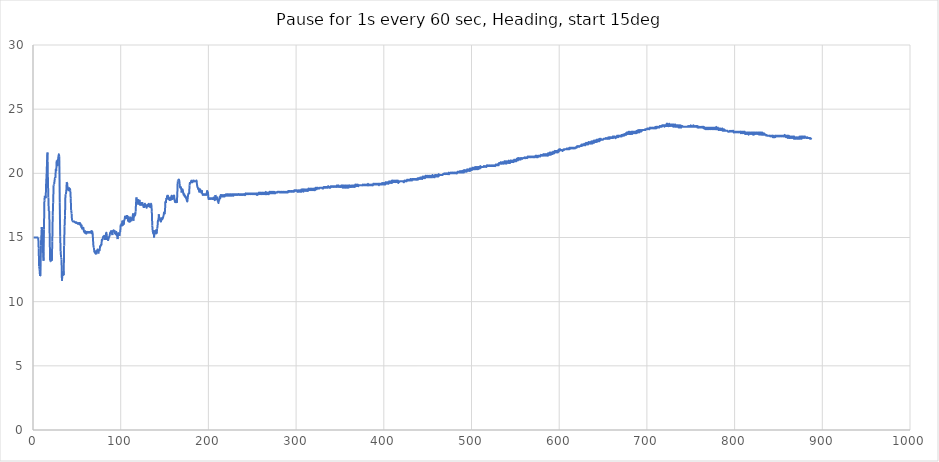
| Category | Column2 |
|---|---|
| 0.5 | 15 |
| 1.0 | 15 |
| 1.5 | 15 |
| 2.0 | 15 |
| 2.5 | 15 |
| 3.0 | 15 |
| 3.5 | 15 |
| 4.0 | 15 |
| 4.5 | 15 |
| 5.0 | 15 |
| 5.5 | 15 |
| 6.0 | 15 |
| 6.5 | 14.125 |
| 7.0 | 12.75 |
| 7.5 | 12.5 |
| 8.0 | 12 |
| 8.5 | 12 |
| 9.0 | 14.375 |
| 9.5 | 15.125 |
| 10.0 | 15.812 |
| 10.5 | 15.188 |
| 11.0 | 13.812 |
| 11.5 | 13.938 |
| 12.0 | 13.188 |
| 12.5 | 15.625 |
| 13.0 | 17.875 |
| 13.5 | 18.25 |
| 14.0 | 18.188 |
| 14.5 | 18.062 |
| 15.0 | 19.25 |
| 15.5 | 19.875 |
| 16.0 | 20.875 |
| 16.5 | 21.625 |
| 17.0 | 19.562 |
| 17.5 | 18.125 |
| 18.0 | 17.062 |
| 18.5 | 17.062 |
| 19.0 | 15.188 |
| 19.5 | 13.25 |
| 20.0 | 13.125 |
| 20.5 | 13.125 |
| 21.0 | 13.625 |
| 21.5 | 13.188 |
| 22.0 | 14.688 |
| 22.5 | 16.688 |
| 23.0 | 17.75 |
| 23.5 | 19.062 |
| 24.0 | 19.125 |
| 24.5 | 19.375 |
| 25.0 | 19.625 |
| 25.5 | 19.625 |
| 26.0 | 20.312 |
| 26.5 | 20.188 |
| 27.0 | 21 |
| 27.5 | 21 |
| 28.0 | 20.562 |
| 28.5 | 21.125 |
| 29.0 | 21.312 |
| 29.5 | 21.5 |
| 30.0 | 21.312 |
| 30.5 | 17.75 |
| 31.0 | 15.062 |
| 31.5 | 13.938 |
| 32.0 | 13.438 |
| 32.5 | 13.312 |
| 33.0 | 11.625 |
| 33.5 | 12.062 |
| 34.0 | 12 |
| 34.5 | 12.375 |
| 35.0 | 12.062 |
| 35.5 | 14.375 |
| 36.0 | 15.875 |
| 36.5 | 16.688 |
| 37.0 | 18.375 |
| 37.5 | 18.375 |
| 38.0 | 18.625 |
| 38.5 | 19.312 |
| 39.0 | 19.25 |
| 39.5 | 18.688 |
| 40.0 | 18.812 |
| 40.5 | 18.688 |
| 41.0 | 18.875 |
| 41.5 | 18.688 |
| 42.0 | 18.812 |
| 42.5 | 18.688 |
| 43.0 | 18.062 |
| 43.5 | 17.125 |
| 44.0 | 16.875 |
| 44.5 | 16.312 |
| 45.0 | 16.312 |
| 45.5 | 16.25 |
| 46.0 | 16.25 |
| 46.5 | 16.25 |
| 47.0 | 16.25 |
| 47.5 | 16.188 |
| 48.0 | 16.188 |
| 48.5 | 16.188 |
| 49.0 | 16.125 |
| 49.5 | 16.188 |
| 50.0 | 16.125 |
| 50.5 | 16.125 |
| 51.0 | 16.062 |
| 51.5 | 16.125 |
| 52.0 | 16.062 |
| 52.5 | 16.125 |
| 53.0 | 16 |
| 53.5 | 16.125 |
| 54.0 | 16.062 |
| 54.5 | 16 |
| 55.0 | 15.812 |
| 55.5 | 15.938 |
| 56.0 | 15.688 |
| 56.5 | 15.75 |
| 57.0 | 15.688 |
| 57.5 | 15.75 |
| 58.0 | 15.5 |
| 58.5 | 15.438 |
| 59.0 | 15.375 |
| 59.5 | 15.5 |
| 60.0 | 15.375 |
| 60.5 | 15.312 |
| 61.0 | 15.312 |
| 61.5 | 15.438 |
| 62.0 | 15.375 |
| 62.5 | 15.438 |
| 63.0 | 15.375 |
| 63.5 | 15.438 |
| 64.0 | 15.375 |
| 64.5 | 15.438 |
| 65.0 | 15.375 |
| 65.5 | 15.438 |
| 66.0 | 15.375 |
| 66.5 | 15.5 |
| 67.0 | 15.312 |
| 67.5 | 15.5 |
| 68.0 | 15.312 |
| 68.5 | 14.75 |
| 69.0 | 14.25 |
| 69.5 | 14.188 |
| 70.0 | 13.875 |
| 70.5 | 13.938 |
| 71.0 | 13.75 |
| 71.5 | 13.938 |
| 72.0 | 13.688 |
| 72.5 | 14 |
| 73.0 | 13.875 |
| 73.5 | 14.062 |
| 74.0 | 14 |
| 74.5 | 13.75 |
| 75.0 | 13.938 |
| 75.5 | 14.062 |
| 76.0 | 14 |
| 76.5 | 14.312 |
| 77.0 | 14.312 |
| 77.5 | 14.438 |
| 78.0 | 14.438 |
| 78.5 | 14.812 |
| 79.0 | 14.812 |
| 79.5 | 14.875 |
| 80.0 | 15.062 |
| 80.5 | 15.062 |
| 81.0 | 15.062 |
| 81.5 | 15.188 |
| 82.0 | 14.812 |
| 82.5 | 15.125 |
| 83.0 | 15.188 |
| 83.5 | 15.375 |
| 84.0 | 15.25 |
| 84.5 | 14.812 |
| 85.0 | 15.062 |
| 85.5 | 14.75 |
| 86.0 | 14.875 |
| 86.5 | 15 |
| 87.0 | 15.062 |
| 87.5 | 15.188 |
| 88.0 | 15.375 |
| 88.5 | 15.375 |
| 89.0 | 15.5 |
| 89.5 | 15.438 |
| 90.0 | 15.375 |
| 90.5 | 15.188 |
| 91.0 | 15.562 |
| 91.5 | 15.5 |
| 92.0 | 15.562 |
| 92.5 | 15.438 |
| 93.0 | 15.562 |
| 93.5 | 15.25 |
| 94.0 | 15.25 |
| 94.5 | 15.312 |
| 95.0 | 15.438 |
| 95.5 | 15.188 |
| 96.0 | 15.25 |
| 96.5 | 14.875 |
| 97.0 | 15.375 |
| 97.5 | 15.125 |
| 98.0 | 15.375 |
| 98.5 | 15.125 |
| 99.0 | 15.375 |
| 99.5 | 15.5 |
| 100.0 | 16 |
| 100.5 | 15.938 |
| 101.0 | 16.062 |
| 101.5 | 15.875 |
| 102.0 | 16.312 |
| 102.5 | 15.938 |
| 103.0 | 16.312 |
| 103.5 | 16 |
| 104.0 | 16.375 |
| 104.5 | 16.438 |
| 105.0 | 16.688 |
| 105.5 | 16.438 |
| 106.0 | 16.625 |
| 106.5 | 16.438 |
| 107.0 | 16.75 |
| 107.5 | 16.5 |
| 108.0 | 16.688 |
| 108.5 | 16.25 |
| 109.0 | 16.562 |
| 109.5 | 16.188 |
| 110.0 | 16.375 |
| 110.5 | 16.188 |
| 111.0 | 16.625 |
| 111.5 | 16.438 |
| 112.0 | 16.5 |
| 112.5 | 16.312 |
| 113.0 | 16.5 |
| 113.5 | 16.5 |
| 114.0 | 16.875 |
| 114.5 | 16.312 |
| 115.0 | 16.75 |
| 115.5 | 16.625 |
| 116.0 | 16.875 |
| 116.5 | 16.75 |
| 117.0 | 17 |
| 117.5 | 17.688 |
| 118.0 | 18.125 |
| 118.5 | 17.688 |
| 119.0 | 17.812 |
| 119.5 | 18 |
| 120.0 | 17.562 |
| 120.5 | 17.875 |
| 121.0 | 17.812 |
| 121.5 | 17.938 |
| 122.0 | 17.5 |
| 122.5 | 17.688 |
| 123.0 | 17.562 |
| 123.5 | 17.75 |
| 124.0 | 17.5 |
| 124.5 | 17.75 |
| 125.0 | 17.5 |
| 125.5 | 17.562 |
| 126.0 | 17.375 |
| 126.5 | 17.438 |
| 127.0 | 17.375 |
| 127.5 | 17.625 |
| 128.0 | 17.562 |
| 128.5 | 17.5 |
| 129.0 | 17.5 |
| 129.5 | 17.312 |
| 130.0 | 17.438 |
| 130.5 | 17.5 |
| 131.0 | 17.562 |
| 131.5 | 17.438 |
| 132.0 | 17.625 |
| 132.5 | 17.5 |
| 133.0 | 17.562 |
| 133.5 | 17.375 |
| 134.0 | 17.438 |
| 134.5 | 17.625 |
| 135.0 | 17.5 |
| 135.5 | 17 |
| 136.0 | 15.938 |
| 136.5 | 15.5 |
| 137.0 | 15.312 |
| 137.5 | 15.562 |
| 138.0 | 15 |
| 138.5 | 15.375 |
| 139.0 | 15.375 |
| 139.5 | 15.562 |
| 140.0 | 15.25 |
| 140.5 | 15.625 |
| 141.0 | 15.312 |
| 141.5 | 15.688 |
| 142.0 | 15.875 |
| 142.5 | 16.375 |
| 143.0 | 16.25 |
| 143.5 | 16.812 |
| 144.0 | 16.5 |
| 144.5 | 16.438 |
| 145.0 | 16.375 |
| 145.5 | 16.312 |
| 146.0 | 16.25 |
| 146.5 | 16.562 |
| 147.0 | 16.375 |
| 147.5 | 16.438 |
| 148.0 | 16.5 |
| 148.5 | 16.625 |
| 149.0 | 16.75 |
| 149.5 | 17 |
| 150.0 | 16.812 |
| 150.5 | 17.062 |
| 151.0 | 17.812 |
| 151.5 | 17.688 |
| 152.0 | 18.062 |
| 152.5 | 18 |
| 153.0 | 18.25 |
| 153.5 | 18.188 |
| 154.0 | 18.25 |
| 154.5 | 17.938 |
| 155.0 | 18.125 |
| 155.5 | 17.938 |
| 156.0 | 17.938 |
| 156.5 | 18.125 |
| 157.0 | 17.938 |
| 157.5 | 18 |
| 158.0 | 18.25 |
| 158.5 | 18.188 |
| 159.0 | 18 |
| 159.5 | 18.125 |
| 160.0 | 18.188 |
| 160.5 | 18.25 |
| 161.0 | 18.25 |
| 161.5 | 17.875 |
| 162.0 | 17.75 |
| 162.5 | 17.875 |
| 163.0 | 17.875 |
| 163.5 | 17.812 |
| 164.0 | 17.688 |
| 164.5 | 18.312 |
| 165.0 | 19.375 |
| 165.5 | 19.438 |
| 166.0 | 19.5 |
| 166.5 | 19.5 |
| 167.0 | 19.312 |
| 167.5 | 18.938 |
| 168.0 | 18.875 |
| 168.5 | 18.938 |
| 169.0 | 18.812 |
| 169.5 | 18.5 |
| 170.0 | 18.688 |
| 170.5 | 18.75 |
| 171.0 | 18.625 |
| 171.5 | 18.375 |
| 172.0 | 18.312 |
| 172.5 | 18.375 |
| 173.0 | 18.188 |
| 173.5 | 18.25 |
| 174.0 | 18.188 |
| 174.5 | 18.062 |
| 175.0 | 18 |
| 175.5 | 17.875 |
| 176.0 | 17.812 |
| 176.5 | 18.125 |
| 177.0 | 18.375 |
| 177.5 | 18.438 |
| 178.0 | 18.375 |
| 178.5 | 19.062 |
| 179.0 | 19.312 |
| 179.5 | 19.25 |
| 180.0 | 19.312 |
| 180.5 | 19.438 |
| 181.0 | 19.312 |
| 181.5 | 19.312 |
| 182.0 | 19.312 |
| 182.5 | 19.438 |
| 183.0 | 19.375 |
| 183.5 | 19.438 |
| 184.0 | 19.375 |
| 184.5 | 19.375 |
| 185.0 | 19.375 |
| 185.5 | 19.375 |
| 186.0 | 19.375 |
| 186.5 | 19.438 |
| 187.0 | 19.125 |
| 187.5 | 18.938 |
| 188.0 | 18.875 |
| 188.5 | 18.75 |
| 189.0 | 18.812 |
| 189.5 | 18.562 |
| 190.0 | 18.625 |
| 190.5 | 18.75 |
| 191.0 | 18.688 |
| 191.5 | 18.562 |
| 192.0 | 18.5 |
| 192.5 | 18.688 |
| 193.0 | 18.375 |
| 193.5 | 18.312 |
| 194.0 | 18.375 |
| 194.5 | 18.312 |
| 195.0 | 18.375 |
| 195.5 | 18.312 |
| 196.0 | 18.375 |
| 196.5 | 18.312 |
| 197.0 | 18.375 |
| 197.5 | 18.312 |
| 198.0 | 18.375 |
| 198.5 | 18.625 |
| 199.0 | 18.562 |
| 199.5 | 18.5 |
| 200.0 | 18.062 |
| 200.5 | 18 |
| 201.0 | 18.062 |
| 201.5 | 18 |
| 202.0 | 18.062 |
| 202.5 | 18 |
| 203.0 | 18.062 |
| 203.5 | 18 |
| 204.0 | 18.062 |
| 204.5 | 18 |
| 205.0 | 18.062 |
| 205.5 | 18 |
| 206.0 | 18.125 |
| 206.5 | 18 |
| 207.0 | 17.938 |
| 207.5 | 17.938 |
| 208.0 | 18.312 |
| 208.5 | 18.125 |
| 209.0 | 18 |
| 209.5 | 18.062 |
| 210.0 | 18.125 |
| 210.5 | 17.875 |
| 211.0 | 17.812 |
| 211.5 | 17.688 |
| 212.0 | 17.938 |
| 212.5 | 17.938 |
| 213.0 | 18.188 |
| 213.5 | 18.062 |
| 214.0 | 18.312 |
| 214.5 | 18.188 |
| 215.0 | 18.312 |
| 215.5 | 18.188 |
| 216.0 | 18.312 |
| 216.5 | 18.188 |
| 217.0 | 18.312 |
| 217.5 | 18.188 |
| 218.0 | 18.312 |
| 218.5 | 18.188 |
| 219.0 | 18.312 |
| 219.5 | 18.25 |
| 220.0 | 18.375 |
| 220.5 | 18.25 |
| 221.0 | 18.375 |
| 221.5 | 18.25 |
| 222.0 | 18.375 |
| 222.5 | 18.25 |
| 223.0 | 18.375 |
| 223.5 | 18.25 |
| 224.0 | 18.375 |
| 224.5 | 18.25 |
| 225.0 | 18.375 |
| 225.5 | 18.25 |
| 226.0 | 18.375 |
| 226.5 | 18.25 |
| 227.0 | 18.375 |
| 227.5 | 18.25 |
| 228.0 | 18.375 |
| 228.5 | 18.25 |
| 229.0 | 18.375 |
| 229.5 | 18.312 |
| 230.0 | 18.375 |
| 230.5 | 18.312 |
| 231.0 | 18.375 |
| 231.5 | 18.312 |
| 232.0 | 18.375 |
| 232.5 | 18.312 |
| 233.0 | 18.375 |
| 233.5 | 18.312 |
| 234.0 | 18.375 |
| 234.5 | 18.375 |
| 235.0 | 18.312 |
| 235.5 | 18.375 |
| 236.0 | 18.312 |
| 236.5 | 18.375 |
| 237.0 | 18.312 |
| 237.5 | 18.375 |
| 238.0 | 18.312 |
| 238.5 | 18.375 |
| 239.0 | 18.312 |
| 239.5 | 18.375 |
| 240.0 | 18.312 |
| 240.5 | 18.375 |
| 241.0 | 18.375 |
| 241.5 | 18.312 |
| 242.0 | 18.312 |
| 242.5 | 18.438 |
| 243.0 | 18.375 |
| 243.5 | 18.438 |
| 244.0 | 18.375 |
| 244.5 | 18.438 |
| 245.0 | 18.375 |
| 245.5 | 18.438 |
| 246.0 | 18.375 |
| 246.5 | 18.438 |
| 247.0 | 18.375 |
| 247.5 | 18.438 |
| 248.0 | 18.375 |
| 248.5 | 18.438 |
| 249.0 | 18.375 |
| 249.5 | 18.438 |
| 250.0 | 18.375 |
| 250.5 | 18.438 |
| 251.0 | 18.375 |
| 251.5 | 18.438 |
| 252.0 | 18.375 |
| 252.5 | 18.438 |
| 253.0 | 18.375 |
| 253.5 | 18.438 |
| 254.0 | 18.375 |
| 254.5 | 18.438 |
| 255.0 | 18.312 |
| 255.5 | 18.438 |
| 256.0 | 18.312 |
| 256.5 | 18.438 |
| 257.0 | 18.375 |
| 257.5 | 18.5 |
| 258.0 | 18.375 |
| 258.5 | 18.5 |
| 259.0 | 18.375 |
| 259.5 | 18.5 |
| 260.0 | 18.375 |
| 260.5 | 18.5 |
| 261.0 | 18.375 |
| 261.5 | 18.5 |
| 262.0 | 18.375 |
| 262.5 | 18.5 |
| 263.0 | 18.375 |
| 263.5 | 18.5 |
| 264.0 | 18.375 |
| 264.5 | 18.5 |
| 265.0 | 18.375 |
| 265.5 | 18.562 |
| 266.0 | 18.375 |
| 266.5 | 18.5 |
| 267.0 | 18.375 |
| 267.5 | 18.5 |
| 268.0 | 18.375 |
| 268.5 | 18.5 |
| 269.0 | 18.375 |
| 269.5 | 18.562 |
| 270.0 | 18.438 |
| 270.5 | 18.562 |
| 271.0 | 18.438 |
| 271.5 | 18.562 |
| 272.0 | 18.438 |
| 272.5 | 18.562 |
| 273.0 | 18.438 |
| 273.5 | 18.562 |
| 274.0 | 18.438 |
| 274.5 | 18.562 |
| 275.0 | 18.438 |
| 275.5 | 18.562 |
| 276.0 | 18.438 |
| 276.5 | 18.5 |
| 277.0 | 18.5 |
| 277.5 | 18.5 |
| 278.0 | 18.5 |
| 278.5 | 18.562 |
| 279.0 | 18.5 |
| 279.5 | 18.562 |
| 280.0 | 18.562 |
| 280.5 | 18.562 |
| 281.0 | 18.562 |
| 281.5 | 18.5 |
| 282.0 | 18.562 |
| 282.5 | 18.5 |
| 283.0 | 18.562 |
| 283.5 | 18.5 |
| 284.0 | 18.562 |
| 284.5 | 18.5 |
| 285.0 | 18.562 |
| 285.5 | 18.5 |
| 286.0 | 18.562 |
| 286.5 | 18.5 |
| 287.0 | 18.562 |
| 287.5 | 18.5 |
| 288.0 | 18.562 |
| 288.5 | 18.5 |
| 289.0 | 18.562 |
| 289.5 | 18.5 |
| 290.0 | 18.562 |
| 290.5 | 18.5 |
| 291.0 | 18.625 |
| 291.5 | 18.562 |
| 292.0 | 18.625 |
| 292.5 | 18.562 |
| 293.0 | 18.625 |
| 293.5 | 18.562 |
| 294.0 | 18.625 |
| 294.5 | 18.562 |
| 295.0 | 18.625 |
| 295.5 | 18.562 |
| 296.0 | 18.625 |
| 296.5 | 18.562 |
| 297.0 | 18.625 |
| 297.5 | 18.562 |
| 298.0 | 18.688 |
| 298.5 | 18.625 |
| 299.0 | 18.688 |
| 299.5 | 18.625 |
| 300.0 | 18.688 |
| 300.5 | 18.625 |
| 301.0 | 18.688 |
| 301.5 | 18.562 |
| 302.0 | 18.562 |
| 302.5 | 18.562 |
| 303.0 | 18.688 |
| 303.5 | 18.562 |
| 304.0 | 18.688 |
| 304.5 | 18.562 |
| 305.0 | 18.688 |
| 305.5 | 18.562 |
| 306.0 | 18.75 |
| 306.5 | 18.562 |
| 307.0 | 18.75 |
| 307.5 | 18.625 |
| 308.0 | 18.75 |
| 308.5 | 18.562 |
| 309.0 | 18.75 |
| 309.5 | 18.625 |
| 310.0 | 18.75 |
| 310.5 | 18.625 |
| 311.0 | 18.75 |
| 311.5 | 18.625 |
| 312.0 | 18.75 |
| 312.5 | 18.625 |
| 313.0 | 18.75 |
| 313.5 | 18.625 |
| 314.0 | 18.812 |
| 314.5 | 18.688 |
| 315.0 | 18.812 |
| 315.5 | 18.688 |
| 316.0 | 18.812 |
| 316.5 | 18.688 |
| 317.0 | 18.812 |
| 317.5 | 18.688 |
| 318.0 | 18.812 |
| 318.5 | 18.688 |
| 319.0 | 18.812 |
| 319.5 | 18.688 |
| 320.0 | 18.812 |
| 320.5 | 18.688 |
| 321.0 | 18.812 |
| 321.5 | 18.688 |
| 322.0 | 18.875 |
| 322.5 | 18.75 |
| 323.0 | 18.875 |
| 323.5 | 18.75 |
| 324.0 | 18.875 |
| 324.5 | 18.812 |
| 325.0 | 18.875 |
| 325.5 | 18.812 |
| 326.0 | 18.812 |
| 326.5 | 18.812 |
| 327.0 | 18.875 |
| 327.5 | 18.875 |
| 328.0 | 18.875 |
| 328.5 | 18.875 |
| 329.0 | 18.875 |
| 329.5 | 18.875 |
| 330.0 | 18.812 |
| 330.5 | 18.875 |
| 331.0 | 18.812 |
| 331.5 | 18.938 |
| 332.0 | 18.875 |
| 332.5 | 18.938 |
| 333.0 | 18.875 |
| 333.5 | 18.938 |
| 334.0 | 18.875 |
| 334.5 | 18.938 |
| 335.0 | 18.875 |
| 335.5 | 18.938 |
| 336.0 | 18.875 |
| 336.5 | 19 |
| 337.0 | 18.938 |
| 337.5 | 18.938 |
| 338.0 | 18.875 |
| 338.5 | 18.938 |
| 339.0 | 18.875 |
| 339.5 | 19 |
| 340.0 | 18.938 |
| 340.5 | 19 |
| 341.0 | 18.938 |
| 341.5 | 19 |
| 342.0 | 18.938 |
| 342.5 | 19 |
| 343.0 | 18.938 |
| 343.5 | 19 |
| 344.0 | 18.938 |
| 344.5 | 19 |
| 345.0 | 18.938 |
| 345.5 | 19 |
| 346.0 | 18.938 |
| 346.5 | 19.062 |
| 347.0 | 18.938 |
| 347.5 | 19.062 |
| 348.0 | 18.938 |
| 348.5 | 19.062 |
| 349.0 | 18.938 |
| 349.5 | 19 |
| 350.0 | 18.938 |
| 350.5 | 19 |
| 351.0 | 18.938 |
| 351.5 | 19.062 |
| 352.0 | 18.938 |
| 352.5 | 19.062 |
| 353.0 | 18.875 |
| 353.5 | 19.062 |
| 354.0 | 18.875 |
| 354.5 | 19.062 |
| 355.0 | 18.875 |
| 355.5 | 19.062 |
| 356.0 | 18.875 |
| 356.5 | 19.062 |
| 357.0 | 18.875 |
| 357.5 | 19.062 |
| 358.0 | 18.875 |
| 358.5 | 19.062 |
| 359.0 | 18.875 |
| 359.5 | 19.062 |
| 360.0 | 18.875 |
| 360.5 | 19.062 |
| 361.0 | 18.938 |
| 361.5 | 19.062 |
| 362.0 | 18.938 |
| 362.5 | 18.938 |
| 363.0 | 18.938 |
| 363.5 | 19.062 |
| 364.0 | 18.938 |
| 364.5 | 19.062 |
| 365.0 | 18.938 |
| 365.5 | 19.062 |
| 366.0 | 18.938 |
| 366.5 | 19.062 |
| 367.0 | 18.938 |
| 367.5 | 19.125 |
| 368.0 | 19 |
| 368.5 | 19.125 |
| 369.0 | 19 |
| 369.5 | 19.125 |
| 370.0 | 19 |
| 370.5 | 19.125 |
| 371.0 | 19 |
| 371.5 | 19.062 |
| 372.0 | 19.062 |
| 372.5 | 19.062 |
| 373.0 | 19.062 |
| 373.5 | 19.062 |
| 374.0 | 19.062 |
| 374.5 | 19.062 |
| 375.0 | 19.062 |
| 375.5 | 19.062 |
| 376.0 | 19.125 |
| 376.5 | 19.062 |
| 377.0 | 19.125 |
| 377.5 | 19.062 |
| 378.0 | 19.125 |
| 378.5 | 19.062 |
| 379.0 | 19.125 |
| 379.5 | 19.062 |
| 380.0 | 19.125 |
| 380.5 | 19.062 |
| 381.0 | 19.125 |
| 381.5 | 19.062 |
| 382.0 | 19.188 |
| 382.5 | 19.062 |
| 383.0 | 19.125 |
| 383.5 | 19.062 |
| 384.0 | 19.125 |
| 384.5 | 19.062 |
| 385.0 | 19.125 |
| 385.5 | 19.062 |
| 386.0 | 19.125 |
| 386.5 | 19.062 |
| 387.0 | 19.125 |
| 387.5 | 19.062 |
| 388.0 | 19.188 |
| 388.5 | 19.125 |
| 389.0 | 19.188 |
| 389.5 | 19.125 |
| 390.0 | 19.188 |
| 390.5 | 19.125 |
| 391.0 | 19.188 |
| 391.5 | 19.125 |
| 392.0 | 19.188 |
| 392.5 | 19.125 |
| 393.0 | 19.188 |
| 393.5 | 19.125 |
| 394.0 | 19.188 |
| 394.5 | 19.062 |
| 395.0 | 19.188 |
| 395.5 | 19.125 |
| 396.0 | 19.188 |
| 396.5 | 19.125 |
| 397.0 | 19.188 |
| 397.5 | 19.125 |
| 398.0 | 19.25 |
| 398.5 | 19.125 |
| 399.0 | 19.25 |
| 399.5 | 19.125 |
| 400.0 | 19.25 |
| 400.5 | 19.125 |
| 401.0 | 19.25 |
| 401.5 | 19.125 |
| 402.0 | 19.312 |
| 402.5 | 19.188 |
| 403.0 | 19.312 |
| 403.5 | 19.188 |
| 404.0 | 19.312 |
| 404.5 | 19.188 |
| 405.0 | 19.312 |
| 405.5 | 19.188 |
| 406.0 | 19.375 |
| 406.5 | 19.25 |
| 407.0 | 19.375 |
| 407.5 | 19.25 |
| 408.0 | 19.375 |
| 408.5 | 19.25 |
| 409.0 | 19.438 |
| 409.5 | 19.25 |
| 410.0 | 19.438 |
| 410.5 | 19.312 |
| 411.0 | 19.438 |
| 411.5 | 19.312 |
| 412.0 | 19.438 |
| 412.5 | 19.312 |
| 413.0 | 19.438 |
| 413.5 | 19.312 |
| 414.0 | 19.438 |
| 414.5 | 19.312 |
| 415.0 | 19.438 |
| 415.5 | 19.312 |
| 416.0 | 19.438 |
| 416.5 | 19.25 |
| 417.0 | 19.375 |
| 417.5 | 19.312 |
| 418.0 | 19.375 |
| 418.5 | 19.375 |
| 419.0 | 19.375 |
| 419.5 | 19.375 |
| 420.0 | 19.375 |
| 420.5 | 19.375 |
| 421.0 | 19.375 |
| 421.5 | 19.375 |
| 422.0 | 19.375 |
| 422.5 | 19.312 |
| 423.0 | 19.312 |
| 423.5 | 19.438 |
| 424.0 | 19.375 |
| 424.5 | 19.438 |
| 425.0 | 19.375 |
| 425.5 | 19.438 |
| 426.0 | 19.375 |
| 426.5 | 19.5 |
| 427.0 | 19.438 |
| 427.5 | 19.5 |
| 428.0 | 19.438 |
| 428.5 | 19.5 |
| 429.0 | 19.438 |
| 429.5 | 19.5 |
| 430.0 | 19.438 |
| 430.5 | 19.562 |
| 431.0 | 19.5 |
| 431.5 | 19.5 |
| 432.0 | 19.438 |
| 432.5 | 19.562 |
| 433.0 | 19.5 |
| 433.5 | 19.562 |
| 434.0 | 19.5 |
| 434.5 | 19.562 |
| 435.0 | 19.5 |
| 435.5 | 19.562 |
| 436.0 | 19.5 |
| 436.5 | 19.562 |
| 437.0 | 19.5 |
| 437.5 | 19.562 |
| 438.0 | 19.5 |
| 438.5 | 19.625 |
| 439.0 | 19.5 |
| 439.5 | 19.625 |
| 440.0 | 19.562 |
| 440.5 | 19.625 |
| 441.0 | 19.562 |
| 441.5 | 19.688 |
| 442.0 | 19.562 |
| 442.5 | 19.688 |
| 443.0 | 19.562 |
| 443.5 | 19.688 |
| 444.0 | 19.562 |
| 444.5 | 19.75 |
| 445.0 | 19.625 |
| 445.5 | 19.75 |
| 446.0 | 19.625 |
| 446.5 | 19.75 |
| 447.0 | 19.625 |
| 447.5 | 19.812 |
| 448.0 | 19.688 |
| 448.5 | 19.812 |
| 449.0 | 19.688 |
| 449.5 | 19.812 |
| 450.0 | 19.688 |
| 450.5 | 19.812 |
| 451.0 | 19.688 |
| 451.5 | 19.812 |
| 452.0 | 19.688 |
| 452.5 | 19.812 |
| 453.0 | 19.688 |
| 453.5 | 19.812 |
| 454.0 | 19.688 |
| 454.5 | 19.812 |
| 455.0 | 19.688 |
| 455.5 | 19.875 |
| 456.0 | 19.75 |
| 456.5 | 19.812 |
| 457.0 | 19.688 |
| 457.5 | 19.812 |
| 458.0 | 19.688 |
| 458.5 | 19.875 |
| 459.0 | 19.75 |
| 459.5 | 19.875 |
| 460.0 | 19.75 |
| 460.5 | 19.875 |
| 461.0 | 19.75 |
| 461.5 | 19.875 |
| 462.0 | 19.75 |
| 462.5 | 19.938 |
| 463.0 | 19.812 |
| 463.5 | 19.875 |
| 464.0 | 19.875 |
| 464.5 | 19.875 |
| 465.0 | 19.875 |
| 465.5 | 19.875 |
| 466.0 | 19.875 |
| 466.5 | 19.875 |
| 467.0 | 19.875 |
| 467.5 | 19.938 |
| 468.0 | 19.938 |
| 468.5 | 19.938 |
| 469.0 | 20 |
| 469.5 | 19.938 |
| 470.0 | 20 |
| 470.5 | 19.938 |
| 471.0 | 20 |
| 471.5 | 19.938 |
| 472.0 | 20 |
| 472.5 | 19.938 |
| 473.0 | 20 |
| 473.5 | 19.938 |
| 474.0 | 20.062 |
| 474.5 | 19.938 |
| 475.0 | 20 |
| 475.5 | 20 |
| 476.0 | 20.062 |
| 476.5 | 20 |
| 477.0 | 20.062 |
| 477.5 | 20 |
| 478.0 | 20.062 |
| 478.5 | 20 |
| 479.0 | 20.062 |
| 479.5 | 20 |
| 480.0 | 20.062 |
| 480.5 | 20 |
| 481.0 | 20.062 |
| 481.5 | 20 |
| 482.0 | 20.062 |
| 482.5 | 20 |
| 483.0 | 20 |
| 483.5 | 20 |
| 484.0 | 20.125 |
| 484.5 | 20.062 |
| 485.0 | 20.125 |
| 485.5 | 20.062 |
| 486.0 | 20.125 |
| 486.5 | 20.062 |
| 487.0 | 20.188 |
| 487.5 | 20.062 |
| 488.0 | 20.125 |
| 488.5 | 20.062 |
| 489.0 | 20.188 |
| 489.5 | 20.062 |
| 490.0 | 20.188 |
| 490.5 | 20.062 |
| 491.0 | 20.25 |
| 491.5 | 20.062 |
| 492.0 | 20.25 |
| 492.5 | 20.125 |
| 493.0 | 20.25 |
| 493.5 | 20.125 |
| 494.0 | 20.25 |
| 494.5 | 20.125 |
| 495.0 | 20.312 |
| 495.5 | 20.188 |
| 496.0 | 20.312 |
| 496.5 | 20.188 |
| 497.0 | 20.312 |
| 497.5 | 20.188 |
| 498.0 | 20.375 |
| 498.5 | 20.188 |
| 499.0 | 20.375 |
| 499.5 | 20.25 |
| 500.0 | 20.375 |
| 500.5 | 20.25 |
| 501.0 | 20.438 |
| 501.5 | 20.312 |
| 502.0 | 20.438 |
| 502.5 | 20.312 |
| 503.0 | 20.438 |
| 503.5 | 20.312 |
| 504.0 | 20.5 |
| 504.5 | 20.312 |
| 505.0 | 20.5 |
| 505.5 | 20.312 |
| 506.0 | 20.5 |
| 506.5 | 20.312 |
| 507.0 | 20.5 |
| 507.5 | 20.312 |
| 508.0 | 20.5 |
| 508.5 | 20.375 |
| 509.0 | 20.5 |
| 509.5 | 20.375 |
| 510.0 | 20.562 |
| 510.5 | 20.438 |
| 511.0 | 20.5 |
| 511.5 | 20.5 |
| 512.0 | 20.5 |
| 512.5 | 20.5 |
| 513.0 | 20.5 |
| 513.5 | 20.5 |
| 514.0 | 20.562 |
| 514.5 | 20.562 |
| 515.0 | 20.5 |
| 515.5 | 20.562 |
| 516.0 | 20.5 |
| 516.5 | 20.562 |
| 517.0 | 20.5 |
| 517.5 | 20.625 |
| 518.0 | 20.562 |
| 518.5 | 20.625 |
| 519.0 | 20.562 |
| 519.5 | 20.625 |
| 520.0 | 20.562 |
| 520.5 | 20.625 |
| 521.0 | 20.562 |
| 521.5 | 20.625 |
| 522.0 | 20.562 |
| 522.5 | 20.625 |
| 523.0 | 20.562 |
| 523.5 | 20.625 |
| 524.0 | 20.562 |
| 524.5 | 20.625 |
| 525.0 | 20.562 |
| 525.5 | 20.625 |
| 526.0 | 20.562 |
| 526.5 | 20.625 |
| 527.0 | 20.562 |
| 527.5 | 20.688 |
| 528.0 | 20.625 |
| 528.5 | 20.688 |
| 529.0 | 20.625 |
| 529.5 | 20.688 |
| 530.0 | 20.625 |
| 530.5 | 20.75 |
| 531.0 | 20.625 |
| 531.5 | 20.812 |
| 532.0 | 20.75 |
| 532.5 | 20.812 |
| 533.0 | 20.75 |
| 533.5 | 20.875 |
| 534.0 | 20.75 |
| 534.5 | 20.812 |
| 535.0 | 20.75 |
| 535.5 | 20.875 |
| 536.0 | 20.75 |
| 536.5 | 20.875 |
| 537.0 | 20.75 |
| 537.5 | 20.938 |
| 538.0 | 20.812 |
| 538.5 | 20.938 |
| 539.0 | 20.75 |
| 539.5 | 20.938 |
| 540.0 | 20.75 |
| 540.5 | 20.938 |
| 541.0 | 20.812 |
| 541.5 | 20.938 |
| 542.0 | 20.812 |
| 542.5 | 21 |
| 543.0 | 20.812 |
| 543.5 | 20.812 |
| 544.0 | 20.812 |
| 544.5 | 21 |
| 545.0 | 20.875 |
| 545.5 | 21 |
| 546.0 | 20.875 |
| 546.5 | 21 |
| 547.0 | 20.875 |
| 547.5 | 21 |
| 548.0 | 20.875 |
| 548.5 | 21.062 |
| 549.0 | 20.938 |
| 549.5 | 21.062 |
| 550.0 | 20.938 |
| 550.5 | 21.062 |
| 551.0 | 20.938 |
| 551.5 | 21.125 |
| 552.0 | 21 |
| 552.5 | 21.188 |
| 553.0 | 21 |
| 553.5 | 21.188 |
| 554.0 | 21.062 |
| 554.5 | 21.188 |
| 555.0 | 21.062 |
| 555.5 | 21.188 |
| 556.0 | 21.062 |
| 556.5 | 21.188 |
| 557.0 | 21.125 |
| 557.5 | 21.188 |
| 558.0 | 21.125 |
| 558.5 | 21.188 |
| 559.0 | 21.188 |
| 559.5 | 21.188 |
| 560.0 | 21.188 |
| 560.5 | 21.25 |
| 561.0 | 21.188 |
| 561.5 | 21.188 |
| 562.0 | 21.25 |
| 562.5 | 21.188 |
| 563.0 | 21.25 |
| 563.5 | 21.188 |
| 564.0 | 21.312 |
| 564.5 | 21.25 |
| 565.0 | 21.312 |
| 565.5 | 21.25 |
| 566.0 | 21.312 |
| 566.5 | 21.25 |
| 567.0 | 21.312 |
| 567.5 | 21.25 |
| 568.0 | 21.312 |
| 568.5 | 21.25 |
| 569.0 | 21.312 |
| 569.5 | 21.25 |
| 570.0 | 21.312 |
| 570.5 | 21.25 |
| 571.0 | 21.312 |
| 571.5 | 21.25 |
| 572.0 | 21.312 |
| 572.5 | 21.25 |
| 573.0 | 21.375 |
| 573.5 | 21.312 |
| 574.0 | 21.375 |
| 574.5 | 21.25 |
| 575.0 | 21.312 |
| 575.5 | 21.25 |
| 576.0 | 21.375 |
| 576.5 | 21.312 |
| 577.0 | 21.375 |
| 577.5 | 21.312 |
| 578.0 | 21.375 |
| 578.5 | 21.312 |
| 579.0 | 21.438 |
| 579.5 | 21.375 |
| 580.0 | 21.438 |
| 580.5 | 21.375 |
| 581.0 | 21.438 |
| 581.5 | 21.375 |
| 582.0 | 21.5 |
| 582.5 | 21.375 |
| 583.0 | 21.5 |
| 583.5 | 21.375 |
| 584.0 | 21.5 |
| 584.5 | 21.375 |
| 585.0 | 21.5 |
| 585.5 | 21.375 |
| 586.0 | 21.5 |
| 586.5 | 21.375 |
| 587.0 | 21.562 |
| 587.5 | 21.375 |
| 588.0 | 21.562 |
| 588.5 | 21.438 |
| 589.0 | 21.625 |
| 589.5 | 21.438 |
| 590.0 | 21.625 |
| 590.5 | 21.438 |
| 591.0 | 21.625 |
| 591.5 | 21.5 |
| 592.0 | 21.625 |
| 592.5 | 21.5 |
| 593.0 | 21.688 |
| 593.5 | 21.562 |
| 594.0 | 21.688 |
| 594.5 | 21.562 |
| 595.0 | 21.75 |
| 595.5 | 21.625 |
| 596.0 | 21.75 |
| 596.5 | 21.625 |
| 597.0 | 21.75 |
| 597.5 | 21.625 |
| 598.0 | 21.75 |
| 598.5 | 21.625 |
| 599.0 | 21.812 |
| 599.5 | 21.688 |
| 600.0 | 21.875 |
| 600.5 | 21.75 |
| 601.0 | 21.875 |
| 601.5 | 21.812 |
| 602.0 | 21.812 |
| 602.5 | 21.812 |
| 603.0 | 21.812 |
| 603.5 | 21.75 |
| 604.0 | 21.75 |
| 604.5 | 21.812 |
| 605.0 | 21.875 |
| 605.5 | 21.812 |
| 606.0 | 21.875 |
| 606.5 | 21.875 |
| 607.0 | 21.875 |
| 607.5 | 21.875 |
| 608.0 | 21.875 |
| 608.5 | 21.938 |
| 609.0 | 21.875 |
| 609.5 | 21.938 |
| 610.0 | 21.875 |
| 610.5 | 21.938 |
| 611.0 | 21.875 |
| 611.5 | 22 |
| 612.0 | 21.875 |
| 612.5 | 22 |
| 613.0 | 21.938 |
| 613.5 | 22 |
| 614.0 | 21.938 |
| 614.5 | 22 |
| 615.0 | 21.938 |
| 615.5 | 22 |
| 616.0 | 21.938 |
| 616.5 | 22 |
| 617.0 | 21.938 |
| 617.5 | 22 |
| 618.0 | 21.938 |
| 618.5 | 22 |
| 619.0 | 22 |
| 619.5 | 22.062 |
| 620.0 | 22 |
| 620.5 | 22.125 |
| 621.0 | 22.062 |
| 621.5 | 22.125 |
| 622.0 | 22.062 |
| 622.5 | 22.125 |
| 623.0 | 22.062 |
| 623.5 | 22.125 |
| 624.0 | 22.125 |
| 624.5 | 22.188 |
| 625.0 | 22.125 |
| 625.5 | 22.25 |
| 626.0 | 22.125 |
| 626.5 | 22.25 |
| 627.0 | 22.188 |
| 627.5 | 22.25 |
| 628.0 | 22.188 |
| 628.5 | 22.312 |
| 629.0 | 22.188 |
| 629.5 | 22.312 |
| 630.0 | 22.188 |
| 630.5 | 22.375 |
| 631.0 | 22.25 |
| 631.5 | 22.375 |
| 632.0 | 22.25 |
| 632.5 | 22.375 |
| 633.0 | 22.25 |
| 633.5 | 22.438 |
| 634.0 | 22.312 |
| 634.5 | 22.438 |
| 635.0 | 22.312 |
| 635.5 | 22.438 |
| 636.0 | 22.312 |
| 636.5 | 22.5 |
| 637.0 | 22.312 |
| 637.5 | 22.5 |
| 638.0 | 22.312 |
| 638.5 | 22.5 |
| 639.0 | 22.375 |
| 639.5 | 22.562 |
| 640.0 | 22.375 |
| 640.5 | 22.562 |
| 641.0 | 22.438 |
| 641.5 | 22.562 |
| 642.0 | 22.438 |
| 642.5 | 22.625 |
| 643.0 | 22.438 |
| 643.5 | 22.625 |
| 644.0 | 22.5 |
| 644.5 | 22.625 |
| 645.0 | 22.5 |
| 645.5 | 22.688 |
| 646.0 | 22.5 |
| 646.5 | 22.688 |
| 647.0 | 22.562 |
| 647.5 | 22.688 |
| 648.0 | 22.625 |
| 648.5 | 22.625 |
| 649.0 | 22.625 |
| 649.5 | 22.625 |
| 650.0 | 22.625 |
| 650.5 | 22.688 |
| 651.0 | 22.688 |
| 651.5 | 22.688 |
| 652.0 | 22.688 |
| 652.5 | 22.688 |
| 653.0 | 22.75 |
| 653.5 | 22.688 |
| 654.0 | 22.75 |
| 654.5 | 22.688 |
| 655.0 | 22.75 |
| 655.5 | 22.688 |
| 656.0 | 22.812 |
| 656.5 | 22.688 |
| 657.0 | 22.812 |
| 657.5 | 22.688 |
| 658.0 | 22.812 |
| 658.5 | 22.75 |
| 659.0 | 22.812 |
| 659.5 | 22.75 |
| 660.0 | 22.812 |
| 660.5 | 22.75 |
| 661.0 | 22.875 |
| 661.5 | 22.75 |
| 662.0 | 22.875 |
| 662.5 | 22.812 |
| 663.0 | 22.875 |
| 663.5 | 22.812 |
| 664.0 | 22.75 |
| 664.5 | 22.75 |
| 665.0 | 22.875 |
| 665.5 | 22.812 |
| 666.0 | 22.938 |
| 666.5 | 22.812 |
| 667.0 | 22.938 |
| 667.5 | 22.812 |
| 668.0 | 22.938 |
| 668.5 | 22.875 |
| 669.0 | 22.938 |
| 669.5 | 22.875 |
| 670.0 | 22.938 |
| 670.5 | 22.875 |
| 671.0 | 23 |
| 671.5 | 22.875 |
| 672.0 | 23 |
| 672.5 | 22.938 |
| 673.0 | 23 |
| 673.5 | 22.938 |
| 674.0 | 23.062 |
| 674.5 | 22.938 |
| 675.0 | 23.062 |
| 675.5 | 23 |
| 676.0 | 23.125 |
| 676.5 | 23 |
| 677.0 | 23.188 |
| 677.5 | 23.062 |
| 678.0 | 23.188 |
| 678.5 | 23.062 |
| 679.0 | 23.25 |
| 679.5 | 23.062 |
| 680.0 | 23.25 |
| 680.5 | 23.062 |
| 681.0 | 23.188 |
| 681.5 | 23.062 |
| 682.0 | 23.25 |
| 682.5 | 23.062 |
| 683.0 | 23.25 |
| 683.5 | 23.062 |
| 684.0 | 23.25 |
| 684.5 | 23.125 |
| 685.0 | 23.25 |
| 685.5 | 23.125 |
| 686.0 | 23.25 |
| 686.5 | 23.125 |
| 687.0 | 23.25 |
| 687.5 | 23.125 |
| 688.0 | 23.312 |
| 688.5 | 23.125 |
| 689.0 | 23.312 |
| 689.5 | 23.188 |
| 690.0 | 23.375 |
| 690.5 | 23.188 |
| 691.0 | 23.375 |
| 691.5 | 23.188 |
| 692.0 | 23.375 |
| 692.5 | 23.25 |
| 693.0 | 23.375 |
| 693.5 | 23.25 |
| 694.0 | 23.375 |
| 694.5 | 23.312 |
| 695.0 | 23.375 |
| 695.5 | 23.375 |
| 696.0 | 23.375 |
| 696.5 | 23.375 |
| 697.0 | 23.375 |
| 697.5 | 23.375 |
| 698.0 | 23.438 |
| 698.5 | 23.375 |
| 699.0 | 23.438 |
| 699.5 | 23.438 |
| 700.0 | 23.438 |
| 700.5 | 23.5 |
| 701.0 | 23.438 |
| 701.5 | 23.5 |
| 702.0 | 23.438 |
| 702.5 | 23.5 |
| 703.0 | 23.438 |
| 703.5 | 23.562 |
| 704.0 | 23.5 |
| 704.5 | 23.562 |
| 705.0 | 23.5 |
| 705.5 | 23.562 |
| 706.0 | 23.5 |
| 706.5 | 23.562 |
| 707.0 | 23.5 |
| 707.5 | 23.562 |
| 708.0 | 23.5 |
| 708.5 | 23.562 |
| 709.0 | 23.5 |
| 709.5 | 23.625 |
| 710.0 | 23.5 |
| 710.5 | 23.625 |
| 711.0 | 23.5 |
| 711.5 | 23.625 |
| 712.0 | 23.562 |
| 712.5 | 23.625 |
| 713.0 | 23.562 |
| 713.5 | 23.625 |
| 714.0 | 23.562 |
| 714.5 | 23.688 |
| 715.0 | 23.625 |
| 715.5 | 23.688 |
| 716.0 | 23.625 |
| 716.5 | 23.688 |
| 717.0 | 23.625 |
| 717.5 | 23.75 |
| 718.0 | 23.688 |
| 718.5 | 23.75 |
| 719.0 | 23.688 |
| 719.5 | 23.75 |
| 720.0 | 23.625 |
| 720.5 | 23.75 |
| 721.0 | 23.688 |
| 721.5 | 23.75 |
| 722.0 | 23.688 |
| 722.5 | 23.875 |
| 723.0 | 23.688 |
| 723.5 | 23.875 |
| 724.0 | 23.688 |
| 724.5 | 23.688 |
| 725.0 | 23.688 |
| 725.5 | 23.875 |
| 726.0 | 23.688 |
| 726.5 | 23.812 |
| 727.0 | 23.688 |
| 727.5 | 23.812 |
| 728.0 | 23.688 |
| 728.5 | 23.812 |
| 729.0 | 23.688 |
| 729.5 | 23.812 |
| 730.0 | 23.625 |
| 730.5 | 23.812 |
| 731.0 | 23.625 |
| 731.5 | 23.812 |
| 732.0 | 23.625 |
| 732.5 | 23.812 |
| 733.0 | 23.625 |
| 733.5 | 23.75 |
| 734.0 | 23.625 |
| 734.5 | 23.75 |
| 735.0 | 23.625 |
| 735.5 | 23.75 |
| 736.0 | 23.562 |
| 736.5 | 23.75 |
| 737.0 | 23.562 |
| 737.5 | 23.75 |
| 738.0 | 23.562 |
| 738.5 | 23.75 |
| 739.0 | 23.562 |
| 739.5 | 23.688 |
| 740.0 | 23.625 |
| 740.5 | 23.688 |
| 741.0 | 23.625 |
| 741.5 | 23.625 |
| 742.0 | 23.625 |
| 742.5 | 23.625 |
| 743.0 | 23.625 |
| 743.5 | 23.625 |
| 744.0 | 23.625 |
| 744.5 | 23.625 |
| 745.0 | 23.625 |
| 745.5 | 23.625 |
| 746.0 | 23.625 |
| 746.5 | 23.625 |
| 747.0 | 23.688 |
| 747.5 | 23.625 |
| 748.0 | 23.688 |
| 748.5 | 23.625 |
| 749.0 | 23.688 |
| 749.5 | 23.625 |
| 750.0 | 23.75 |
| 750.5 | 23.625 |
| 751.0 | 23.688 |
| 751.5 | 23.625 |
| 752.0 | 23.688 |
| 752.5 | 23.625 |
| 753.0 | 23.75 |
| 753.5 | 23.625 |
| 754.0 | 23.688 |
| 754.5 | 23.625 |
| 755.0 | 23.688 |
| 755.5 | 23.625 |
| 756.0 | 23.688 |
| 756.5 | 23.625 |
| 757.0 | 23.688 |
| 757.5 | 23.562 |
| 758.0 | 23.688 |
| 758.5 | 23.562 |
| 759.0 | 23.625 |
| 759.5 | 23.562 |
| 760.0 | 23.625 |
| 760.5 | 23.562 |
| 761.0 | 23.625 |
| 761.5 | 23.562 |
| 762.0 | 23.625 |
| 762.5 | 23.562 |
| 763.0 | 23.625 |
| 763.5 | 23.562 |
| 764.0 | 23.625 |
| 764.5 | 23.5 |
| 765.0 | 23.625 |
| 765.5 | 23.5 |
| 766.0 | 23.562 |
| 766.5 | 23.438 |
| 767.0 | 23.562 |
| 767.5 | 23.438 |
| 768.0 | 23.562 |
| 768.5 | 23.438 |
| 769.0 | 23.562 |
| 769.5 | 23.438 |
| 770.0 | 23.562 |
| 770.5 | 23.438 |
| 771.0 | 23.562 |
| 771.5 | 23.438 |
| 772.0 | 23.562 |
| 772.5 | 23.438 |
| 773.0 | 23.562 |
| 773.5 | 23.438 |
| 774.0 | 23.562 |
| 774.5 | 23.438 |
| 775.0 | 23.562 |
| 775.5 | 23.438 |
| 776.0 | 23.562 |
| 776.5 | 23.438 |
| 777.0 | 23.562 |
| 777.5 | 23.438 |
| 778.0 | 23.562 |
| 778.5 | 23.438 |
| 779.0 | 23.625 |
| 779.5 | 23.438 |
| 780.0 | 23.562 |
| 780.5 | 23.438 |
| 781.0 | 23.562 |
| 781.5 | 23.375 |
| 782.0 | 23.5 |
| 782.5 | 23.375 |
| 783.0 | 23.5 |
| 783.5 | 23.375 |
| 784.0 | 23.5 |
| 784.5 | 23.375 |
| 785.0 | 23.375 |
| 785.5 | 23.375 |
| 786.0 | 23.5 |
| 786.5 | 23.312 |
| 787.0 | 23.438 |
| 787.5 | 23.312 |
| 788.0 | 23.438 |
| 788.5 | 23.312 |
| 789.0 | 23.375 |
| 789.5 | 23.312 |
| 790.0 | 23.312 |
| 790.5 | 23.312 |
| 791.0 | 23.312 |
| 791.5 | 23.312 |
| 792.0 | 23.312 |
| 792.5 | 23.25 |
| 793.0 | 23.25 |
| 793.5 | 23.25 |
| 794.0 | 23.25 |
| 794.5 | 23.312 |
| 795.0 | 23.25 |
| 795.5 | 23.312 |
| 796.0 | 23.25 |
| 796.5 | 23.312 |
| 797.0 | 23.25 |
| 797.5 | 23.312 |
| 798.0 | 23.25 |
| 798.5 | 23.312 |
| 799.0 | 23.188 |
| 799.5 | 23.25 |
| 800.0 | 23.188 |
| 800.5 | 23.25 |
| 801.0 | 23.188 |
| 801.5 | 23.25 |
| 802.0 | 23.188 |
| 802.5 | 23.25 |
| 803.0 | 23.188 |
| 803.5 | 23.25 |
| 804.0 | 23.188 |
| 804.5 | 23.25 |
| 805.0 | 23.188 |
| 805.5 | 23.25 |
| 806.0 | 23.188 |
| 806.5 | 23.25 |
| 807.0 | 23.125 |
| 807.5 | 23.25 |
| 808.0 | 23.125 |
| 808.5 | 23.25 |
| 809.0 | 23.125 |
| 809.5 | 23.25 |
| 810.0 | 23.125 |
| 810.5 | 23.25 |
| 811.0 | 23.125 |
| 811.5 | 23.25 |
| 812.0 | 23.062 |
| 812.5 | 23.188 |
| 813.0 | 23.062 |
| 813.5 | 23.188 |
| 814.0 | 23.062 |
| 814.5 | 23.188 |
| 815.0 | 23.062 |
| 815.5 | 23.188 |
| 816.0 | 23 |
| 816.5 | 23.188 |
| 817.0 | 23.062 |
| 817.5 | 23.188 |
| 818.0 | 23.062 |
| 818.5 | 23.188 |
| 819.0 | 23.062 |
| 819.5 | 23.188 |
| 820.0 | 23.062 |
| 820.5 | 23.188 |
| 821.0 | 23 |
| 821.5 | 23.188 |
| 822.0 | 23 |
| 822.5 | 23.188 |
| 823.0 | 23.062 |
| 823.5 | 23.188 |
| 824.0 | 23.062 |
| 824.5 | 23.188 |
| 825.0 | 23.062 |
| 825.5 | 23.188 |
| 826.0 | 23.062 |
| 826.5 | 23.188 |
| 827.0 | 23.062 |
| 827.5 | 23.188 |
| 828.0 | 23 |
| 828.5 | 23.188 |
| 829.0 | 23.062 |
| 829.5 | 23.188 |
| 830.0 | 23 |
| 830.5 | 23.188 |
| 831.0 | 23 |
| 831.5 | 23.188 |
| 832.0 | 23 |
| 832.5 | 23.125 |
| 833.0 | 23 |
| 833.5 | 23.125 |
| 834.0 | 23 |
| 834.5 | 23.062 |
| 835.0 | 23 |
| 835.5 | 23 |
| 836.0 | 22.938 |
| 836.5 | 23 |
| 837.0 | 22.938 |
| 837.5 | 22.938 |
| 838.0 | 22.938 |
| 838.5 | 22.938 |
| 839.0 | 22.938 |
| 839.5 | 22.938 |
| 840.0 | 22.938 |
| 840.5 | 22.875 |
| 841.0 | 22.938 |
| 841.5 | 22.875 |
| 842.0 | 22.938 |
| 842.5 | 22.875 |
| 843.0 | 22.938 |
| 843.5 | 22.812 |
| 844.0 | 22.938 |
| 844.5 | 22.812 |
| 845.0 | 22.812 |
| 845.5 | 22.812 |
| 846.0 | 22.938 |
| 846.5 | 22.812 |
| 847.0 | 22.938 |
| 847.5 | 22.875 |
| 848.0 | 22.938 |
| 848.5 | 22.875 |
| 849.0 | 22.938 |
| 849.5 | 22.875 |
| 850.0 | 22.938 |
| 850.5 | 22.875 |
| 851.0 | 22.938 |
| 851.5 | 22.875 |
| 852.0 | 22.938 |
| 852.5 | 22.875 |
| 853.0 | 22.938 |
| 853.5 | 22.875 |
| 854.0 | 22.938 |
| 854.5 | 22.875 |
| 855.0 | 22.938 |
| 855.5 | 22.875 |
| 856.0 | 22.938 |
| 856.5 | 22.875 |
| 857.0 | 23 |
| 857.5 | 22.875 |
| 858.0 | 22.938 |
| 858.5 | 22.812 |
| 859.0 | 22.938 |
| 859.5 | 22.812 |
| 860.0 | 22.938 |
| 860.5 | 22.75 |
| 861.0 | 22.938 |
| 861.5 | 22.75 |
| 862.0 | 22.938 |
| 862.5 | 22.75 |
| 863.0 | 22.875 |
| 863.5 | 22.75 |
| 864.0 | 22.875 |
| 864.5 | 22.75 |
| 865.0 | 22.875 |
| 865.5 | 22.75 |
| 866.0 | 22.875 |
| 866.5 | 22.75 |
| 867.0 | 22.875 |
| 867.5 | 22.688 |
| 868.0 | 22.875 |
| 868.5 | 22.688 |
| 869.0 | 22.812 |
| 869.5 | 22.688 |
| 870.0 | 22.812 |
| 870.5 | 22.688 |
| 871.0 | 22.812 |
| 871.5 | 22.688 |
| 872.0 | 22.812 |
| 872.5 | 22.688 |
| 873.0 | 22.812 |
| 873.5 | 22.688 |
| 874.0 | 22.875 |
| 874.5 | 22.688 |
| 875.0 | 22.875 |
| 875.5 | 22.688 |
| 876.0 | 22.875 |
| 876.5 | 22.688 |
| 877.0 | 22.875 |
| 877.5 | 22.75 |
| 878.0 | 22.875 |
| 878.5 | 22.75 |
| 879.0 | 22.875 |
| 879.5 | 22.75 |
| 880.0 | 22.875 |
| 880.5 | 22.812 |
| 881.0 | 22.812 |
| 881.5 | 22.75 |
| 882.0 | 22.812 |
| 882.5 | 22.75 |
| 883.0 | 22.812 |
| 883.5 | 22.75 |
| 884.0 | 22.75 |
| 884.5 | 22.75 |
| 885.0 | 22.75 |
| 885.5 | 22.75 |
| 886.0 | 22.688 |
| 886.5 | 22.75 |
| 887.0 | 22.688 |
| 887.5 | 22.75 |